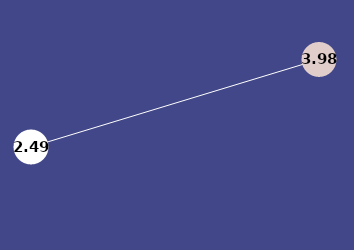
| Category | Series 0 |
|---|---|
| 0 | 2.488 |
| 1 | 3.983 |